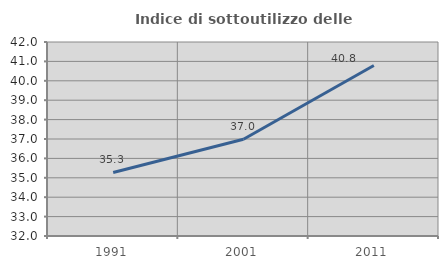
| Category | Indice di sottoutilizzo delle abitazioni  |
|---|---|
| 1991.0 | 35.274 |
| 2001.0 | 36.985 |
| 2011.0 | 40.788 |